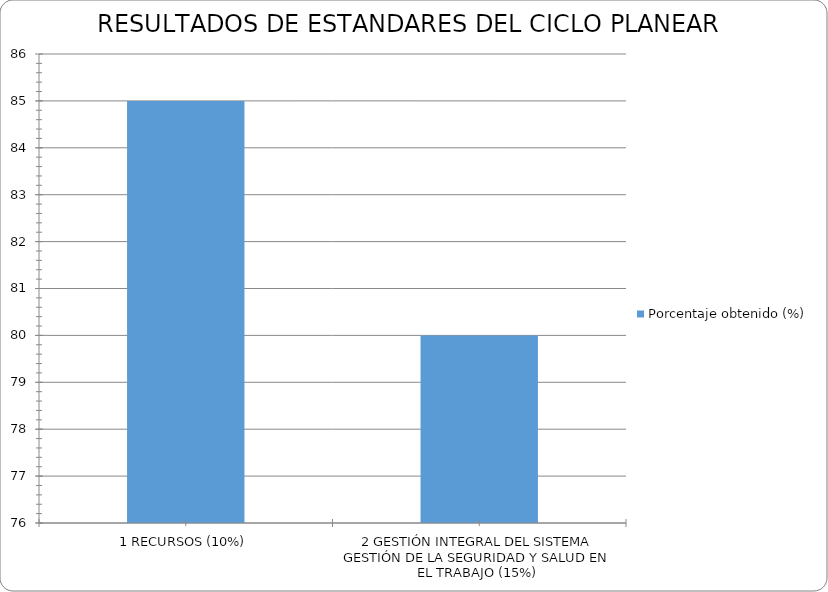
| Category | Porcentaje obtenido (%) |
|---|---|
| 1 RECURSOS (10%) | 85 |
| 2 GESTIÓN INTEGRAL DEL SISTEMA GESTIÓN DE LA SEGURIDAD Y SALUD EN EL TRABAJO (15%) | 80 |